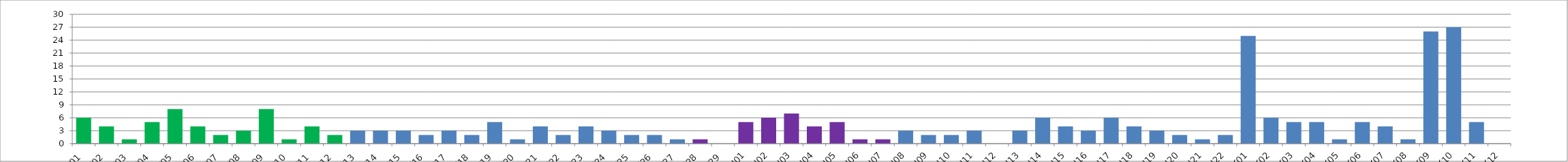
| Category | Series 0 |
|---|---|
| W01 | 6 |
| W02 | 4 |
| W03 | 1 |
| W04 | 5 |
| W05 | 8 |
| W06 | 4 |
| W07 | 2 |
| W08 | 3 |
| W09 | 8 |
| W10 | 1 |
| W11 | 4 |
| W12 | 2 |
| W13 | 3 |
| W14 | 3 |
| W15 | 3 |
| W16 | 2 |
| W17 | 3 |
| W18 | 2 |
| W19 | 5 |
| W20 | 1 |
| W21 | 4 |
| W22 | 2 |
| W23 | 4 |
| W24 | 3 |
| W25 | 2 |
| W26 | 2 |
| W27 | 1 |
| W28 | 1 |
| W29 | 0 |
| U01 | 5 |
| U02 | 6 |
| U03 | 7 |
| U04 | 4 |
| U05 | 5 |
| U06 | 1 |
| U07 | 1 |
| U08 | 3 |
| U09 | 2 |
| U10 | 2 |
| U11 | 3 |
| U12 | 0 |
| U13 | 3 |
| U14 | 6 |
| U15 | 4 |
| U16 | 3 |
| U17 | 6 |
| U18 | 4 |
| U19 | 3 |
| U20 | 2 |
| U21 | 1 |
| U22 | 2 |
| K01 | 25 |
| K02 | 6 |
| K03 | 5 |
| K04 | 5 |
| K05 | 1 |
| K06 | 5 |
| K07 | 4 |
| K08 | 1 |
| K09 | 26 |
| K10 | 27 |
| K11 | 5 |
| K12 | 0 |